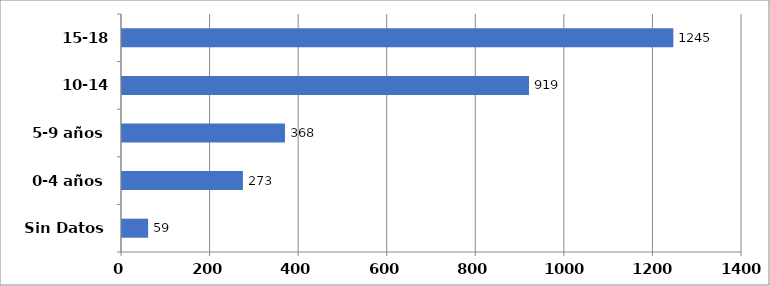
| Category | Series 0 |
|---|---|
| Sin Datos | 59 |
| 0-4 años | 273 |
| 5-9 años | 368 |
| 10-14 años | 919 |
| 15-18 años | 1245 |